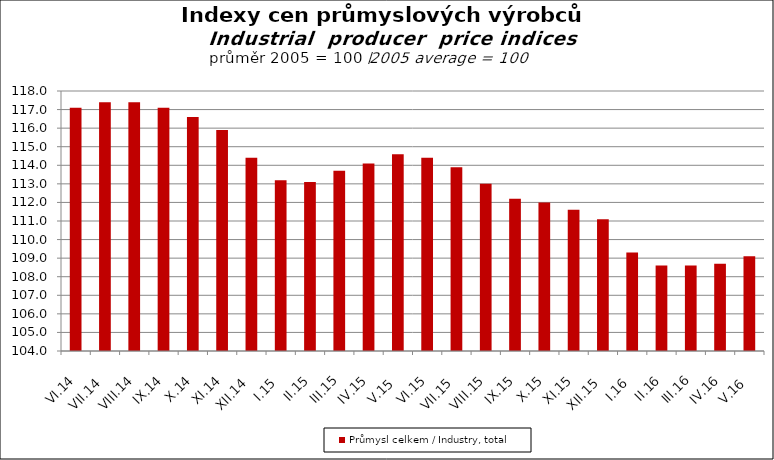
| Category | Průmysl celkem / Industry, total |
|---|---|
| VI.14 | 117.1 |
| VII.14 | 117.4 |
| VIII.14 | 117.4 |
| IX.14 | 117.1 |
| X.14 | 116.6 |
| XI.14 | 115.9 |
| XII.14 | 114.4 |
| I.15 | 113.2 |
| II.15 | 113.1 |
| III.15 | 113.7 |
| IV.15 | 114.1 |
| V.15 | 114.6 |
| VI.15 | 114.4 |
| VII.15 | 113.9 |
| VIII.15 | 113 |
| IX.15 | 112.2 |
| X.15 | 112 |
| XI.15 | 111.6 |
| XII.15 | 111.1 |
| I.16 | 109.3 |
| II.16 | 108.6 |
| III.16 | 108.6 |
| IV.16 | 108.7 |
| V.16 | 109.1 |